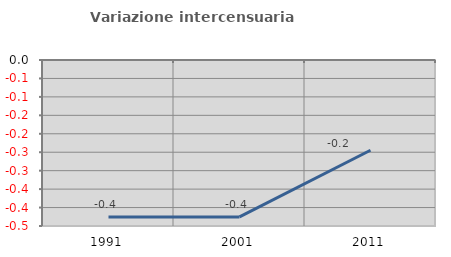
| Category | Variazione intercensuaria annua |
|---|---|
| 1991.0 | -0.426 |
| 2001.0 | -0.425 |
| 2011.0 | -0.245 |